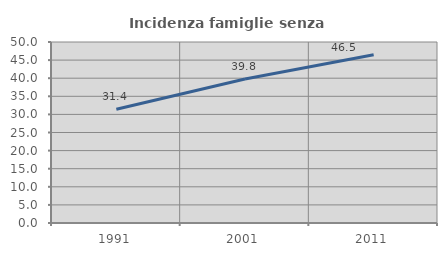
| Category | Incidenza famiglie senza nuclei |
|---|---|
| 1991.0 | 31.41 |
| 2001.0 | 39.771 |
| 2011.0 | 46.457 |